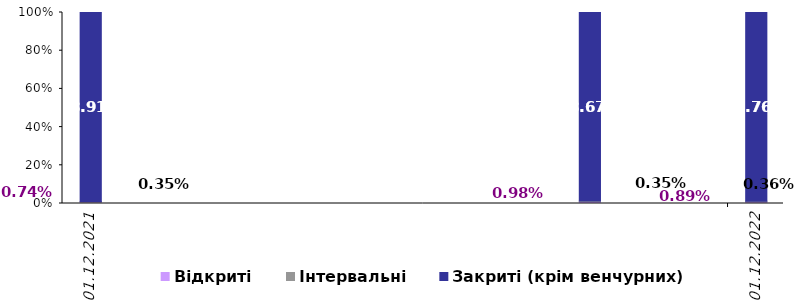
| Category | Відкриті | Інтервальні | Закриті (крім венчурних) |
|---|---|---|---|
| 2021-12-31 | 0.007 | 0.003 | 0.989 |
| 2022-09-30 | 0.01 | 0.004 | 0.987 |
| 2022-12-31 | 0.009 | 0.004 | 0.988 |